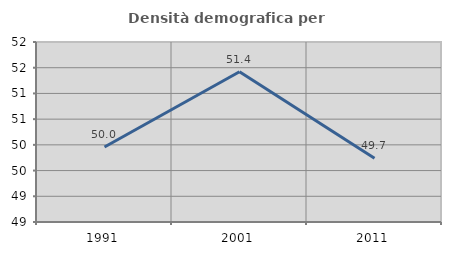
| Category | Densità demografica |
|---|---|
| 1991.0 | 49.959 |
| 2001.0 | 51.422 |
| 2011.0 | 49.739 |